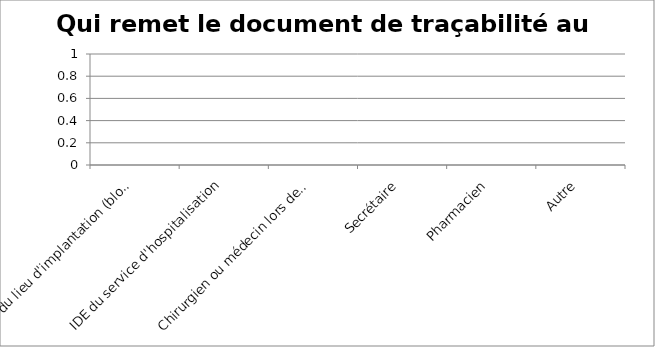
| Category | Qui remet le document de traçabilité au patient ? |
|---|---|
| IDE du lieu d'implantation (bloc opératoire, service…) | 0 |
| IDE du service d'hospitalisation | 0 |
| Chirurgien ou médecin lors de la visite contrôle | 0 |
| Secrétaire | 0 |
| Pharmacien | 0 |
| Autre | 0 |